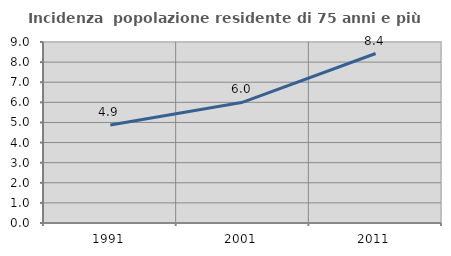
| Category | Incidenza  popolazione residente di 75 anni e più |
|---|---|
| 1991.0 | 4.869 |
| 2001.0 | 6.007 |
| 2011.0 | 8.427 |